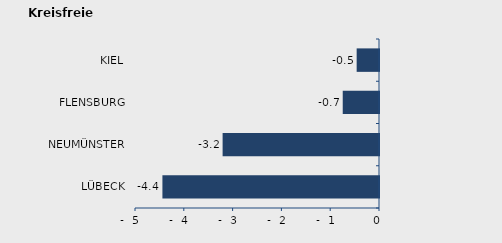
| Category | Überschuss der Geborenen (+) bzw. Gestorbenen (-) |
|---|---|
| LÜBECK | -4.438 |
| NEUMÜNSTER | -3.205 |
| FLENSBURG | -0.743 |
| KIEL | -0.458 |